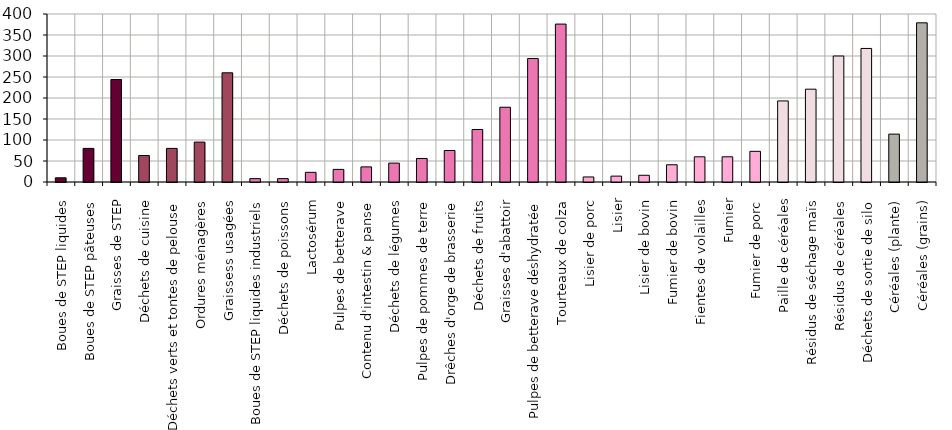
| Category | Series 0 |
|---|---|
| Boues de STEP liquides | 10 |
| Boues de STEP pâteuses | 80 |
| Graisses de STEP | 244 |
| Déchets de cuisine | 63 |
| Déchets verts et tontes de pelouse | 80 |
| Ordures ménagères | 95 |
| Graissess usagées | 260 |
| Boues de STEP liquides industriels | 8 |
| Déchets de poissons | 8 |
| Lactosérum | 23 |
| Pulpes de betterave | 30 |
| Contenu d'intestin & panse | 36 |
| Déchets de légumes | 45 |
| Pulpes de pommes de terre | 56 |
| Drêches d'orge de brasserie | 75 |
| Déchets de fruits | 125 |
| Graisses d'abattoir | 178 |
| Pulpes de betterave déshydratée | 294 |
| Tourteaux de colza | 376 |
| Lisier de porc | 12 |
| Lisier | 14 |
| Lisier de bovin | 16 |
| Fumier de bovin | 41 |
| Fientes de volailles | 60 |
| Fumier | 60 |
| Fumier de porc | 73 |
| Paille de céréales | 193 |
| Résidus de séchage maïs | 221 |
| Résidus de céréales | 300 |
| Déchets de sortie de silo | 318 |
| Céréales (plante) | 114 |
| Céréales (grains) | 379 |